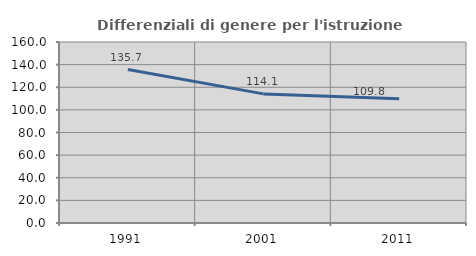
| Category | Differenziali di genere per l'istruzione superiore |
|---|---|
| 1991.0 | 135.666 |
| 2001.0 | 114.14 |
| 2011.0 | 109.787 |